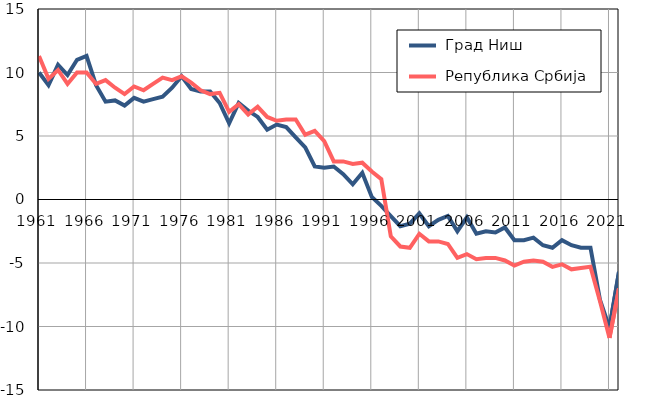
| Category |  Град Ниш |  Република Србија |
|---|---|---|
| 1961.0 | 10 | 11.3 |
| 1962.0 | 9 | 9.5 |
| 1963.0 | 10.6 | 10.2 |
| 1964.0 | 9.8 | 9.1 |
| 1965.0 | 11 | 10 |
| 1966.0 | 11.3 | 10 |
| 1967.0 | 9 | 9.1 |
| 1968.0 | 7.7 | 9.4 |
| 1969.0 | 7.8 | 8.8 |
| 1970.0 | 7.4 | 8.3 |
| 1971.0 | 8 | 8.9 |
| 1972.0 | 7.7 | 8.6 |
| 1973.0 | 7.9 | 9.1 |
| 1974.0 | 8.1 | 9.6 |
| 1975.0 | 8.8 | 9.4 |
| 1976.0 | 9.7 | 9.7 |
| 1977.0 | 8.7 | 9.2 |
| 1978.0 | 8.5 | 8.6 |
| 1979.0 | 8.5 | 8.3 |
| 1980.0 | 7.6 | 8.4 |
| 1981.0 | 6 | 6.9 |
| 1982.0 | 7.6 | 7.5 |
| 1983.0 | 7 | 6.7 |
| 1984.0 | 6.5 | 7.3 |
| 1985.0 | 5.5 | 6.5 |
| 1986.0 | 5.9 | 6.2 |
| 1987.0 | 5.7 | 6.3 |
| 1988.0 | 4.9 | 6.3 |
| 1989.0 | 4.1 | 5.1 |
| 1990.0 | 2.6 | 5.4 |
| 1991.0 | 2.5 | 4.6 |
| 1992.0 | 2.6 | 3 |
| 1993.0 | 2 | 3 |
| 1994.0 | 1.2 | 2.8 |
| 1995.0 | 2.1 | 2.9 |
| 1996.0 | 0.2 | 2.2 |
| 1997.0 | -0.5 | 1.6 |
| 1998.0 | -1.3 | -2.9 |
| 1999.0 | -2.1 | -3.7 |
| 2000.0 | -1.9 | -3.8 |
| 2001.0 | -1.1 | -2.7 |
| 2002.0 | -2.1 | -3.3 |
| 2003.0 | -1.6 | -3.3 |
| 2004.0 | -1.3 | -3.5 |
| 2005.0 | -2.5 | -4.6 |
| 2006.0 | -1.4 | -4.3 |
| 2007.0 | -2.7 | -4.7 |
| 2008.0 | -2.5 | -4.6 |
| 2009.0 | -2.6 | -4.6 |
| 2010.0 | -2.2 | -4.8 |
| 2011.0 | -3.2 | -5.2 |
| 2012.0 | -3.2 | -4.9 |
| 2013.0 | -3 | -4.8 |
| 2014.0 | -3.6 | -4.9 |
| 2015.0 | -3.8 | -5.3 |
| 2016.0 | -3.2 | -5.1 |
| 2017.0 | -3.6 | -5.5 |
| 2018.0 | -3.8 | -5.4 |
| 2019.0 | -3.8 | -5.3 |
| 2020.0 | -7.9 | -8 |
| 2021.0 | -10.1 | -10.9 |
| 2022.0 | -5.7 | -7 |